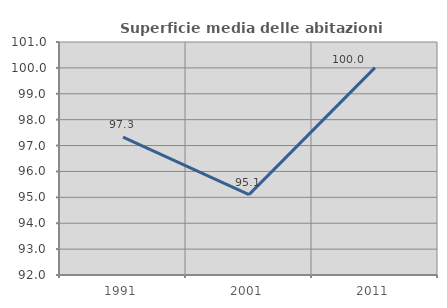
| Category | Superficie media delle abitazioni occupate |
|---|---|
| 1991.0 | 97.33 |
| 2001.0 | 95.106 |
| 2011.0 | 100.008 |